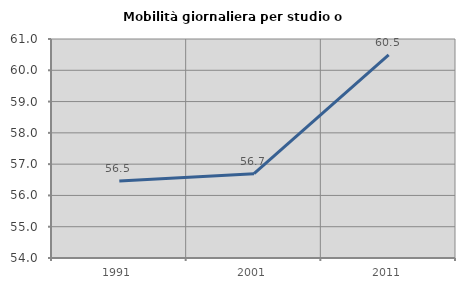
| Category | Mobilità giornaliera per studio o lavoro |
|---|---|
| 1991.0 | 56.464 |
| 2001.0 | 56.695 |
| 2011.0 | 60.491 |